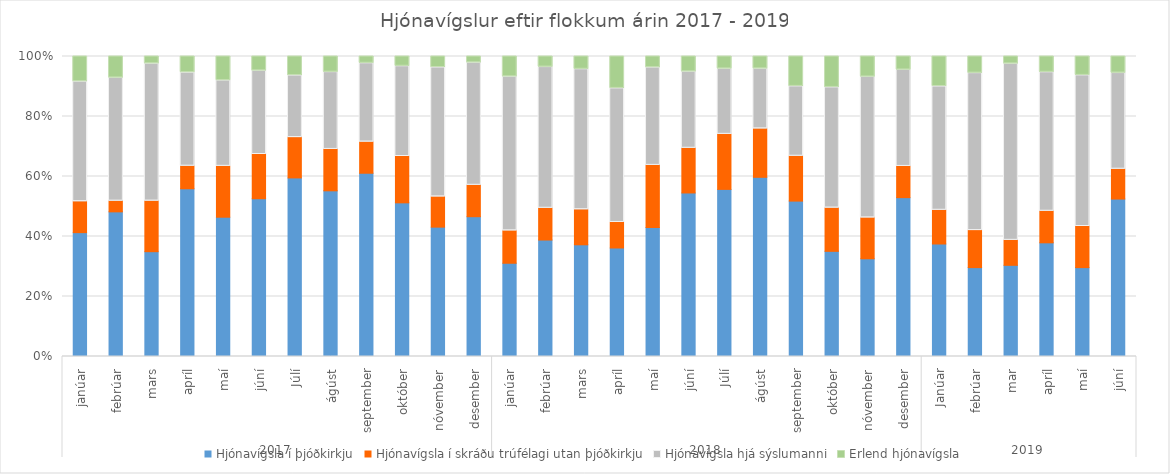
| Category | Hjónavígsla í þjóðkirkju | Hjónavígsla í skráðu trúfélagi utan þjóðkirkju | Hjónavígsla hjá sýslumanni | Erlend hjónavígsla |
|---|---|---|---|---|
| 0 | 64 | 16 | 62 | 13 |
| 1 | 54 | 4 | 46 | 8 |
| 2 | 58 | 28 | 76 | 4 |
| 3 | 104 | 14 | 58 | 10 |
| 4 | 104 | 38 | 64 | 18 |
| 5 | 264 | 74 | 140 | 24 |
| 6 | 478 | 108 | 166 | 51 |
| 7 | 296 | 74 | 138 | 28 |
| 8 | 270 | 46 | 116 | 10 |
| 9 | 126 | 38 | 74 | 8 |
| 10 | 94 | 22 | 94 | 8 |
| 11 | 178 | 40 | 156 | 8 |
| 12 | 46 | 16 | 76 | 10 |
| 13 | 66 | 18 | 80 | 6 |
| 14 | 70 | 22 | 88 | 8 |
| 15 | 68 | 16 | 84 | 20 |
| 16 | 116 | 56 | 88 | 10 |
| 17 | 278 | 76 | 130 | 26 |
| 18 | 337 | 111 | 132 | 25 |
| 19 | 436 | 118 | 146 | 30 |
| 20 | 187 | 54 | 84 | 36 |
| 21 | 68 | 28 | 78 | 20 |
| 22 | 86 | 36 | 124 | 18 |
| 23 | 224 | 44 | 136 | 19 |
| 24 | 60 | 18 | 66 | 16 |
| 25 | 48 | 20 | 85 | 9 |
| 26 | 62 | 17 | 120 | 5 |
| 27 | 72 | 20 | 88 | 10 |
| 28 | 80 | 37 | 136 | 17 |
| 29 | 190 | 36 | 116 | 20 |